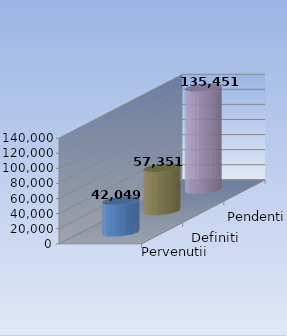
| Category | Pervenutii | Definiti | Pendenti |
|---|---|---|---|
| 0 | 42049 | 57351 | 135451 |